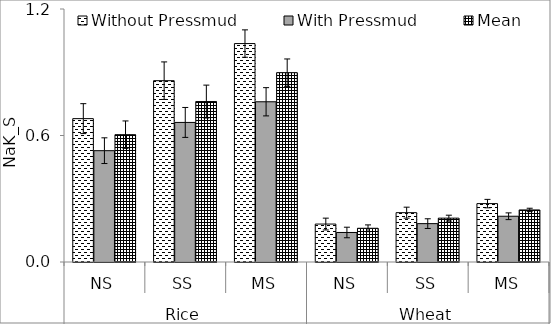
| Category | Without Pressmud | With Pressmud | Mean |
|---|---|---|---|
| 0 | 0.68 | 0.528 | 0.604 |
| 1 | 0.86 | 0.662 | 0.761 |
| 2 | 1.036 | 0.76 | 0.898 |
| 3 | 0.18 | 0.14 | 0.16 |
| 4 | 0.234 | 0.182 | 0.208 |
| 5 | 0.277 | 0.217 | 0.247 |